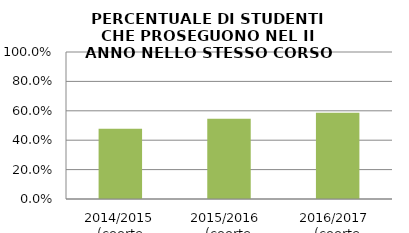
| Category | 2014/2015 (coorte 2013/14) 2015/2016  (coorte 2014/15) 2016/2017  (coorte 2015/16) |
|---|---|
| 2014/2015 (coorte 2013/14) | 0.478 |
| 2015/2016  (coorte 2014/15) | 0.547 |
| 2016/2017  (coorte 2015/16) | 0.586 |